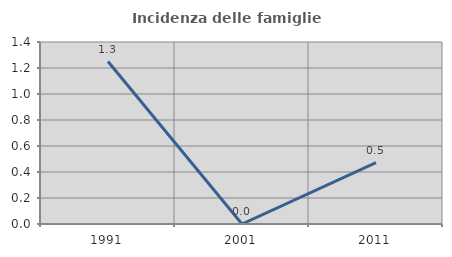
| Category | Incidenza delle famiglie numerose |
|---|---|
| 1991.0 | 1.25 |
| 2001.0 | 0 |
| 2011.0 | 0.472 |